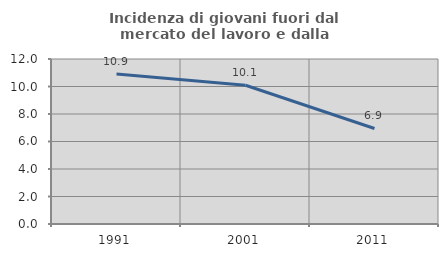
| Category | Incidenza di giovani fuori dal mercato del lavoro e dalla formazione  |
|---|---|
| 1991.0 | 10.909 |
| 2001.0 | 10.089 |
| 2011.0 | 6.949 |